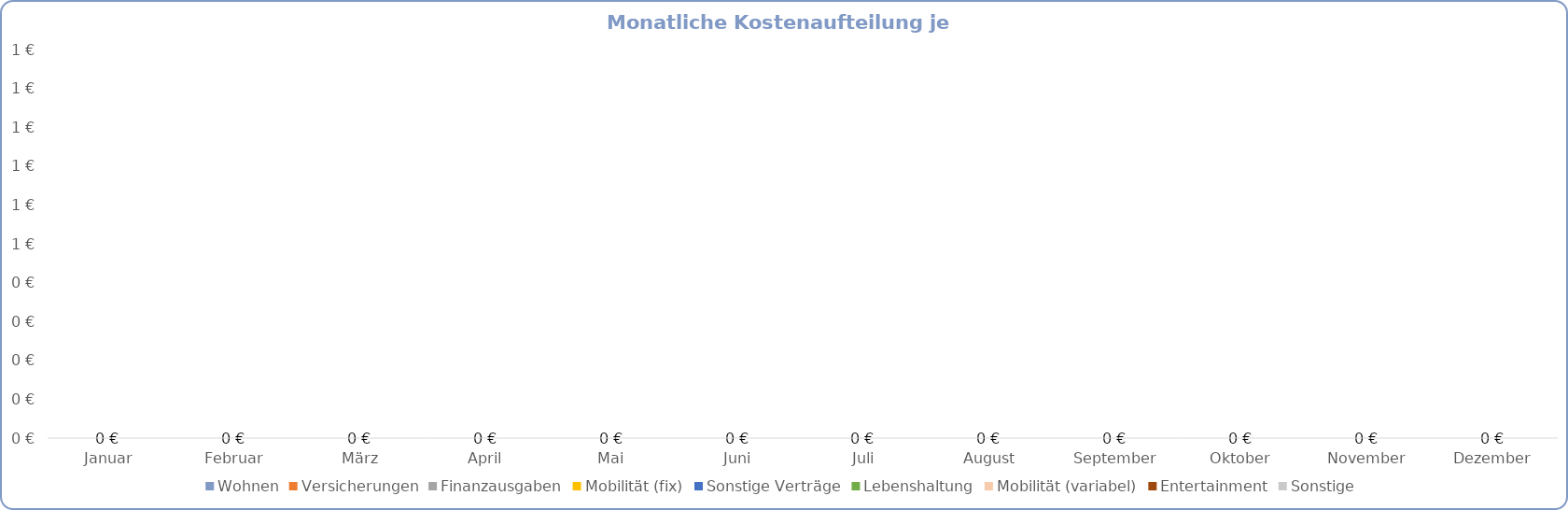
| Category |  Wohnen  |  Versicherungen  |  Finanzausgaben  |  Mobilität (fix)  |  Sonstige Verträge  |  Lebenshaltung  |  Mobilität (variabel)  |  Entertainment  |  Sonstige  |
|---|---|---|---|---|---|---|---|---|---|
| Januar | 0 | 0 | 0 | 0 | 0 | 0 | 0 | 0 | 0 |
| Februar | 0 | 0 | 0 | 0 | 0 | 0 | 0 | 0 | 0 |
| März | 0 | 0 | 0 | 0 | 0 | 0 | 0 | 0 | 0 |
| April | 0 | 0 | 0 | 0 | 0 | 0 | 0 | 0 | 0 |
| Mai | 0 | 0 | 0 | 0 | 0 | 0 | 0 | 0 | 0 |
| Juni | 0 | 0 | 0 | 0 | 0 | 0 | 0 | 0 | 0 |
| Juli | 0 | 0 | 0 | 0 | 0 | 0 | 0 | 0 | 0 |
| August | 0 | 0 | 0 | 0 | 0 | 0 | 0 | 0 | 0 |
| September | 0 | 0 | 0 | 0 | 0 | 0 | 0 | 0 | 0 |
| Oktober | 0 | 0 | 0 | 0 | 0 | 0 | 0 | 0 | 0 |
| November | 0 | 0 | 0 | 0 | 0 | 0 | 0 | 0 | 0 |
| Dezember | 0 | 0 | 0 | 0 | 0 | 0 | 0 | 0 | 0 |